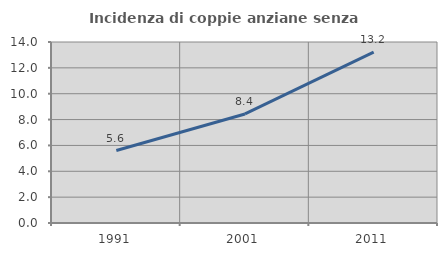
| Category | Incidenza di coppie anziane senza figli  |
|---|---|
| 1991.0 | 5.603 |
| 2001.0 | 8.436 |
| 2011.0 | 13.21 |